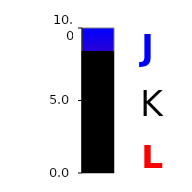
| Category | Series 0 |
|---|---|
| 0 | 8.378 |